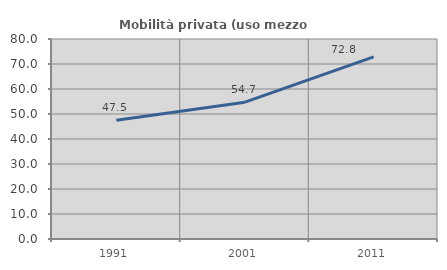
| Category | Mobilità privata (uso mezzo privato) |
|---|---|
| 1991.0 | 47.458 |
| 2001.0 | 54.717 |
| 2011.0 | 72.84 |